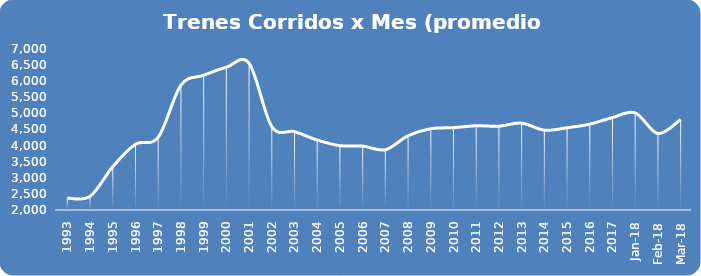
| Category | Series 0 |
|---|---|
| 1993.0 | 2368.667 |
| 1994.0 | 2424.667 |
| 1995.0 | 3347.75 |
| 1996.0 | 4044 |
| 1997.0 | 4260.583 |
| 1998.0 | 5875.25 |
| 1999.0 | 6183.917 |
| 2000.0 | 6432 |
| 2001.0 | 6558.167 |
| 2002.0 | 4590.667 |
| 2003.0 | 4434.417 |
| 2004.0 | 4171.417 |
| 2005.0 | 3998 |
| 2006.0 | 3985 |
| 2007.0 | 3870.75 |
| 2008.0 | 4307.083 |
| 2009.0 | 4524.25 |
| 2010.0 | 4557 |
| 2011.0 | 4615.667 |
| 2012.0 | 4602.417 |
| 2013.0 | 4698.167 |
| 2014.0 | 4478.083 |
| 2015.0 | 4553.833 |
| 2016.0 | 4665.833 |
| 2017.0 | 4870.667 |
| 43101.0 | 5016 |
| 43132.0 | 4374 |
| 43160.0 | 4811 |